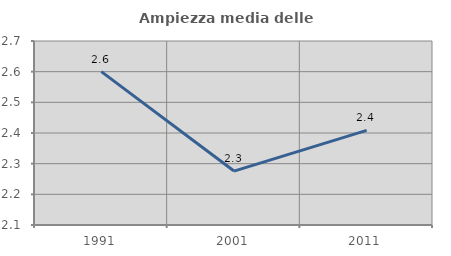
| Category | Ampiezza media delle famiglie |
|---|---|
| 1991.0 | 2.6 |
| 2001.0 | 2.276 |
| 2011.0 | 2.408 |